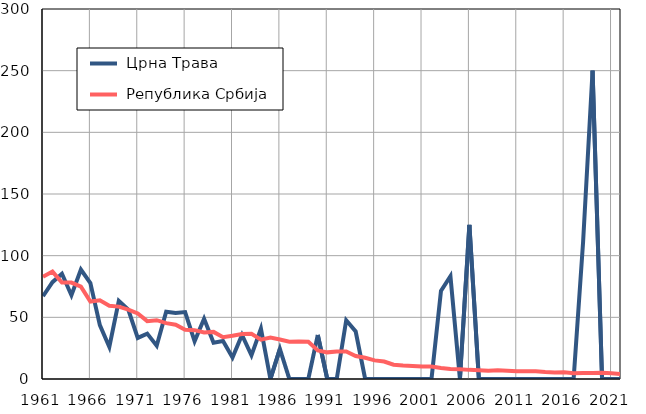
| Category |  Црна Трава |  Република Србија |
|---|---|---|
| 1961.0 | 67.1 | 82.9 |
| 1962.0 | 78.5 | 87.1 |
| 1963.0 | 85.3 | 78.2 |
| 1964.0 | 67.9 | 78.2 |
| 1965.0 | 88.8 | 74.9 |
| 1966.0 | 77.8 | 62.8 |
| 1967.0 | 43.7 | 63.8 |
| 1968.0 | 26 | 59.4 |
| 1969.0 | 63.4 | 58.7 |
| 1970.0 | 56.3 | 56.3 |
| 1971.0 | 33.3 | 53.1 |
| 1972.0 | 36.8 | 46.9 |
| 1973.0 | 27 | 47.7 |
| 1974.0 | 54.5 | 45.3 |
| 1975.0 | 53.6 | 44 |
| 1976.0 | 54.3 | 39.9 |
| 1977.0 | 30.6 | 39.6 |
| 1978.0 | 48.8 | 37.8 |
| 1979.0 | 29.4 | 38.2 |
| 1980.0 | 30.8 | 33.9 |
| 1981.0 | 17.5 | 35 |
| 1982.0 | 35.7 | 36.5 |
| 1983.0 | 19.2 | 36.6 |
| 1984.0 | 40.8 | 31.9 |
| 1985.0 | 0 | 33.7 |
| 1986.0 | 24.4 | 32 |
| 1987.0 | 0 | 30.2 |
| 1988.0 | 0 | 30.5 |
| 1989.0 | 0 | 30.2 |
| 1990.0 | 35.7 | 23.2 |
| 1991.0 | 0 | 21.6 |
| 1992.0 | 0 | 22.3 |
| 1993.0 | 47.6 | 22.3 |
| 1994.0 | 38.5 | 18.6 |
| 1995.0 | 0 | 17.2 |
| 1996.0 | 0 | 15.1 |
| 1997.0 | 0 | 14.2 |
| 1998.0 | 0 | 11.6 |
| 1999.0 | 0 | 11 |
| 2000.0 | 0 | 10.6 |
| 2001.0 | 0 | 10.2 |
| 2002.0 | 0 | 10.1 |
| 2003.0 | 71.4 | 9 |
| 2004.0 | 83.3 | 8.1 |
| 2005.0 | 0 | 8 |
| 2006.0 | 125 | 7.4 |
| 2007.0 | 0 | 7.1 |
| 2008.0 | 0 | 6.7 |
| 2009.0 | 0 | 7 |
| 2010.0 | 0 | 6.7 |
| 2011.0 | 0 | 6.3 |
| 2012.0 | 0 | 6.2 |
| 2013.0 | 0 | 6.3 |
| 2014.0 | 0 | 5.7 |
| 2015.0 | 0 | 5.3 |
| 2016.0 | 0 | 5.4 |
| 2017.0 | 0 | 4.7 |
| 2018.0 | 111.1 | 4.9 |
| 2019.0 | 250 | 4.8 |
| 2020.0 | 0 | 5 |
| 2021.0 | 0 | 4.7 |
| 2022.0 | 0 | 4 |